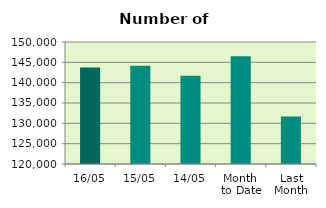
| Category | Series 0 |
|---|---|
| 16/05 | 143710 |
| 15/05 | 144180 |
| 14/05 | 141722 |
| Month 
to Date | 146513.273 |
| Last
Month | 131708.5 |